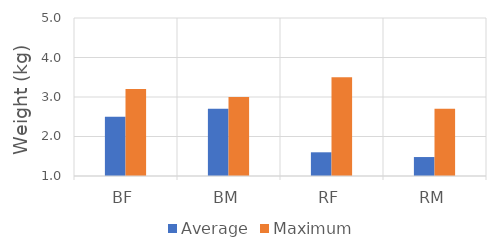
| Category | Average | Maximum |
|---|---|---|
| BF | 2.5 | 3.2 |
| BM | 2.7 | 3 |
| RF | 1.6 | 3.5 |
| RM | 1.48 | 2.7 |